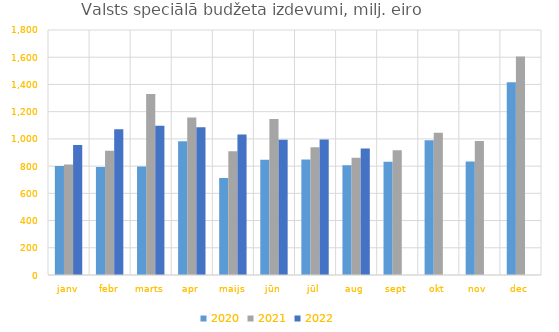
| Category | 2020 | 2021 | 2022 |
|---|---|---|---|
| janv | 800513.176 | 812540.784 | 954604.585 |
| febr | 793560.967 | 913452.191 | 1070533.109 |
| marts | 796946.618 | 1329058.335 | 1096177.665 |
| apr | 981781.839 | 1156902.965 | 1085060.388 |
| maijs | 711775.073 | 909621.75 | 1032376.247 |
| jūn | 846260.327 | 1146703.878 | 994027.105 |
| jūl | 848728.248 | 939467.851 | 994781.699 |
| aug | 805848.679 | 860719.856 | 929865.805 |
| sept | 832590.985 | 915890.517 | 0 |
| okt | 990572.907 | 1045656.477 | 0 |
| nov | 834311.145 | 984919.983 | 0 |
| dec | 1416800.012 | 1605011.589 | 0 |